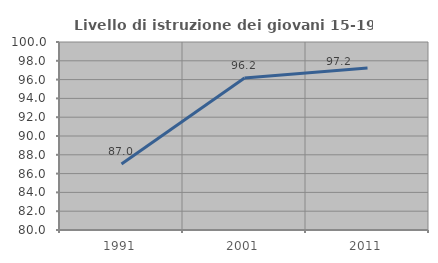
| Category | Livello di istruzione dei giovani 15-19 anni |
|---|---|
| 1991.0 | 87.024 |
| 2001.0 | 96.177 |
| 2011.0 | 97.226 |